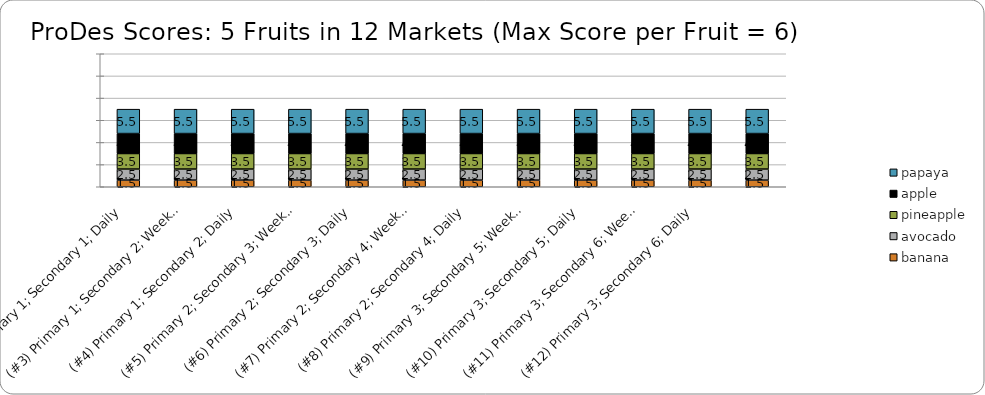
| Category | banana | avocado | pineapple | apple | papaya |
|---|---|---|---|---|---|
| (#2) Primary 1; Secondary 1; Daily | 1.5 | 2.5 | 3.5 | 4.5 | 5.5 |
| (#3) Primary 1; Secondary 2; Weekly | 1.5 | 2.5 | 3.5 | 4.5 | 5.5 |
| (#4) Primary 1; Secondary 2; Daily | 1.5 | 2.5 | 3.5 | 4.5 | 5.5 |
| (#5) Primary 2; Secondary 3; Weekly | 1.5 | 2.5 | 3.5 | 4.5 | 5.5 |
| (#6) Primary 2; Secondary 3; Daily | 1.5 | 2.5 | 3.5 | 4.5 | 5.5 |
| (#7) Primary 2; Secondary 4; Weekly | 1.5 | 2.5 | 3.5 | 4.5 | 5.5 |
| (#8) Primary 2; Secondary 4; Daily | 1.5 | 2.5 | 3.5 | 4.5 | 5.5 |
| (#9) Primary 3; Secondary 5; Weekly | 1.5 | 2.5 | 3.5 | 4.5 | 5.5 |
| (#10) Primary 3; Secondary 5; Daily | 1.5 | 2.5 | 3.5 | 4.5 | 5.5 |
| (#11) Primary 3; Secondary 6; Weekly | 1.5 | 2.5 | 3.5 | 4.5 | 5.5 |
| (#12) Primary 3; Secondary 6; Daily | 1.5 | 2.5 | 3.5 | 4.5 | 5.5 |